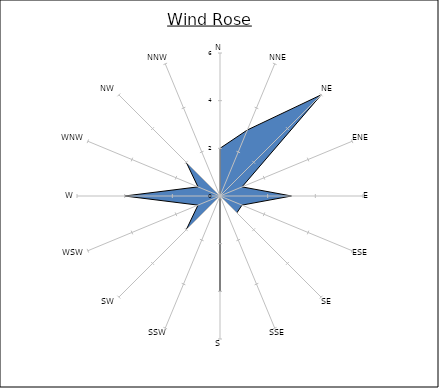
| Category | Series 0 |
|---|---|
| N | 2 |
| NNE | 3 |
| NE | 6 |
| ENE | 1 |
| E | 3 |
| ESE | 1 |
| SE | 1 |
| SSE | 0 |
| S | 4 |
| SSW | 0 |
| SW | 2 |
| WSW | 1 |
| W | 4 |
| WNW | 1 |
| NW | 2 |
| NNW | 0 |